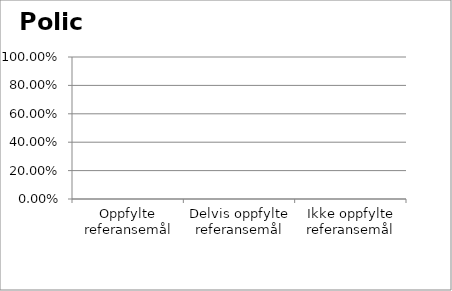
| Category | Policy |
|---|---|
| Oppfylte referansemål | 0 |
| Delvis oppfylte referansemål | 0 |
| Ikke oppfylte referansemål | 0 |